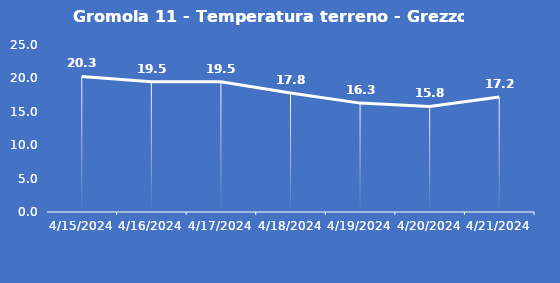
| Category | Gromola 11 - Temperatura terreno - Grezzo (°C) |
|---|---|
| 4/15/24 | 20.3 |
| 4/16/24 | 19.5 |
| 4/17/24 | 19.5 |
| 4/18/24 | 17.8 |
| 4/19/24 | 16.3 |
| 4/20/24 | 15.8 |
| 4/21/24 | 17.2 |